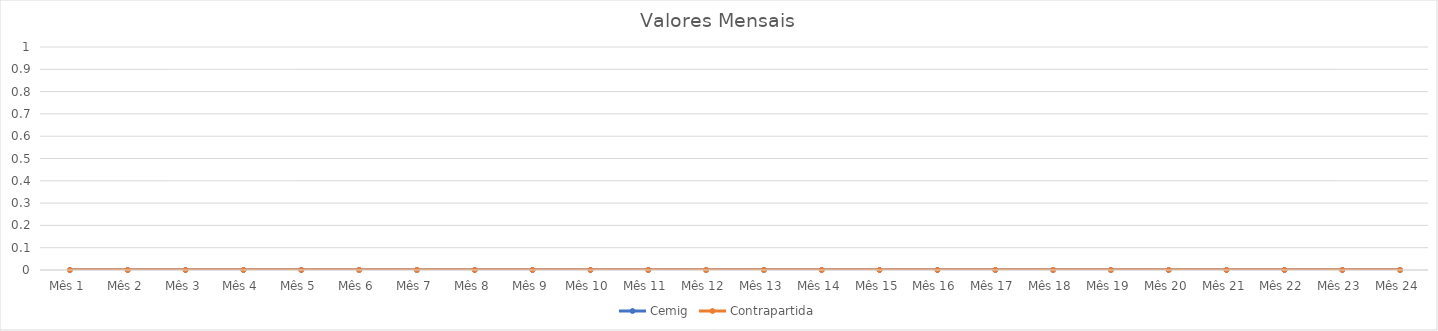
| Category | Cemig | Contrapartida |
|---|---|---|
| Mês 1 | 0 | 0 |
| Mês 2 | 0 | 0 |
| Mês 3 | 0 | 0 |
| Mês 4 | 0 | 0 |
| Mês 5 | 0 | 0 |
| Mês 6 | 0 | 0 |
| Mês 7 | 0 | 0 |
| Mês 8 | 0 | 0 |
| Mês 9 | 0 | 0 |
| Mês 10 | 0 | 0 |
| Mês 11 | 0 | 0 |
| Mês 12 | 0 | 0 |
| Mês 13 | 0 | 0 |
| Mês 14 | 0 | 0 |
| Mês 15 | 0 | 0 |
| Mês 16 | 0 | 0 |
| Mês 17 | 0 | 0 |
| Mês 18 | 0 | 0 |
| Mês 19 | 0 | 0 |
| Mês 20 | 0 | 0 |
| Mês 21 | 0 | 0 |
| Mês 22 | 0 | 0 |
| Mês 23 | 0 | 0 |
| Mês 24 | 0 | 0 |